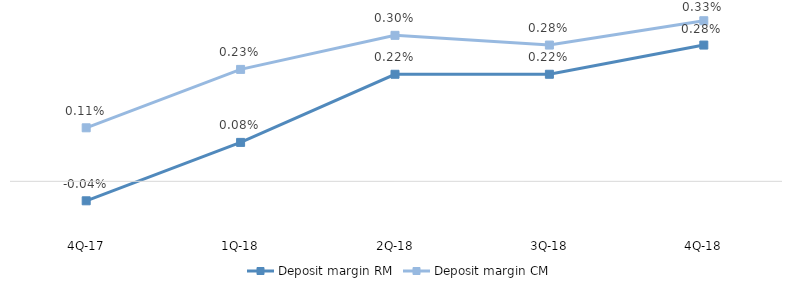
| Category | Deposit margin RM | Deposit margin CM |
|---|---|---|
| 4Q-18 | 0.003 | 0.003 |
| 3Q-18 | 0.002 | 0.003 |
| 2Q-18 | 0.002 | 0.003 |
| 1Q-18 | 0.001 | 0.002 |
| 4Q-17 | 0 | 0.001 |